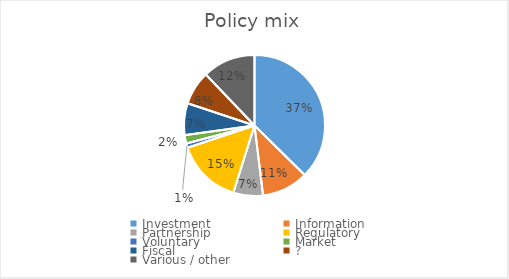
| Category | Series 0 |
|---|---|
| Investment | 77 |
| Information | 22 |
| Partnership | 14 |
| Regulatory | 31 |
| Voluntary | 2 |
| Market | 4 |
| Fiscal | 15 |
| ? | 16 |
| Various / other | 25 |